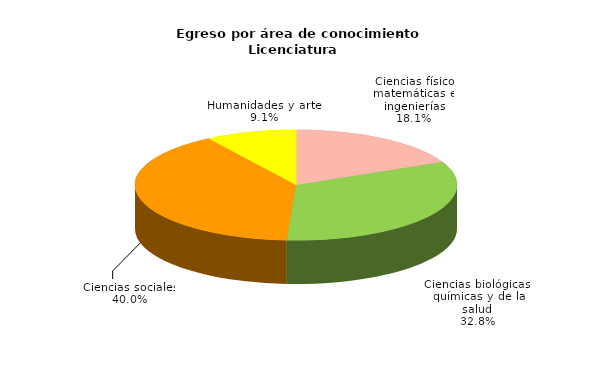
| Category | Series 0 |
|---|---|
| Ciencias físico matemáticas e ingenierías | 5859 |
| Ciencias biológicas, químicas y de la salud | 10597 |
| Ciencias sociales | 12921 |
| Humanidades y artes | 2944 |